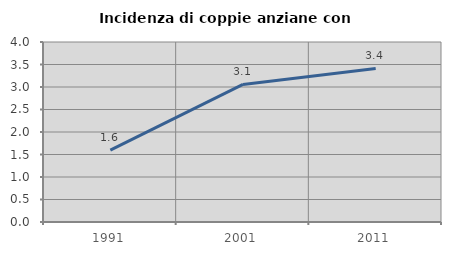
| Category | Incidenza di coppie anziane con figli |
|---|---|
| 1991.0 | 1.598 |
| 2001.0 | 3.056 |
| 2011.0 | 3.413 |